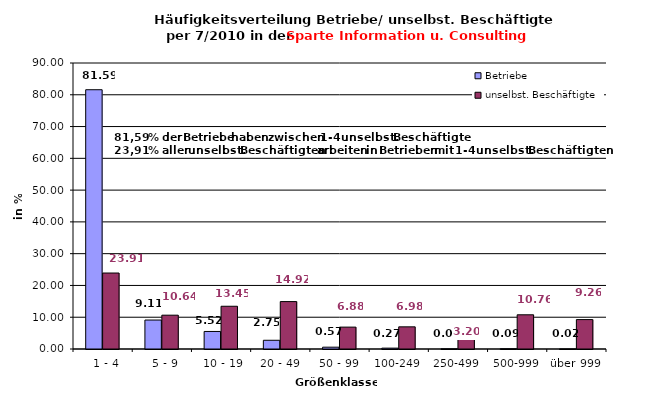
| Category | Betriebe | unselbst. Beschäftigte |
|---|---|---|
|   1 - 4 | 81.589 | 23.909 |
|   5 - 9 | 9.114 | 10.643 |
|  10 - 19 | 5.519 | 13.448 |
| 20 - 49 | 2.748 | 14.921 |
| 50 - 99 | 0.572 | 6.884 |
| 100-249 | 0.275 | 6.975 |
| 250-499 | 0.069 | 3.199 |
| 500-999 | 0.092 | 10.763 |
| über 999 | 0.023 | 9.257 |